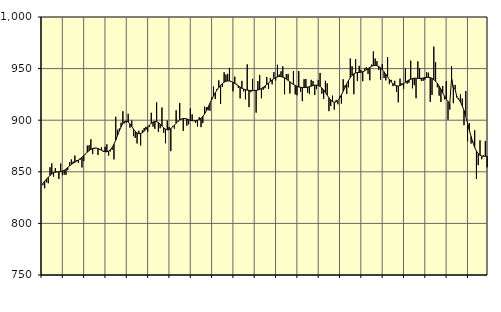
| Category | Piggar | Series 1 |
|---|---|---|
| nan | 837 | 838.9 |
| 1.0 | 834 | 840.96 |
| 1.0 | 839.9 | 842.87 |
| 1.0 | 838.9 | 844.65 |
| 1.0 | 854.4 | 846.36 |
| 1.0 | 858.2 | 847.87 |
| 1.0 | 845.3 | 848.96 |
| 1.0 | 853.5 | 849.65 |
| 1.0 | 850.2 | 849.94 |
| 1.0 | 843.1 | 850.06 |
| 1.0 | 858 | 850.23 |
| 1.0 | 846.8 | 850.65 |
| nan | 847.2 | 851.45 |
| 2.0 | 847.1 | 852.67 |
| 2.0 | 851.6 | 854.14 |
| 2.0 | 859.2 | 855.68 |
| 2.0 | 862 | 857.07 |
| 2.0 | 859.9 | 858.26 |
| 2.0 | 865.7 | 859.32 |
| 2.0 | 861.2 | 860.35 |
| 2.0 | 858.5 | 861.45 |
| 2.0 | 861.7 | 862.71 |
| 2.0 | 854.2 | 864.14 |
| 2.0 | 860.4 | 865.7 |
| nan | 866.9 | 867.37 |
| 3.0 | 875.4 | 869.02 |
| 3.0 | 875.8 | 870.52 |
| 3.0 | 881.5 | 871.74 |
| 3.0 | 867.1 | 872.55 |
| 3.0 | 872.2 | 872.94 |
| 3.0 | 873.2 | 872.95 |
| 3.0 | 866.4 | 872.54 |
| 3.0 | 871.2 | 871.82 |
| 3.0 | 873.6 | 870.94 |
| 3.0 | 869.3 | 870.08 |
| 3.0 | 874.2 | 869.51 |
| nan | 876.6 | 869.43 |
| 4.0 | 865.7 | 869.99 |
| 4.0 | 869.8 | 871.36 |
| 4.0 | 871.4 | 873.59 |
| 4.0 | 862 | 876.74 |
| 4.0 | 903.3 | 880.7 |
| 4.0 | 890.7 | 885.12 |
| 4.0 | 892 | 889.56 |
| 4.0 | 897.5 | 893.59 |
| 4.0 | 908.7 | 896.74 |
| 4.0 | 897 | 898.63 |
| 4.0 | 897.9 | 899.1 |
| nan | 906.2 | 898.25 |
| 5.0 | 892.8 | 896.38 |
| 5.0 | 899.6 | 893.91 |
| 5.0 | 884.5 | 891.32 |
| 5.0 | 882.8 | 889.13 |
| 5.0 | 877.5 | 887.59 |
| 5.0 | 889.8 | 886.86 |
| 5.0 | 875.5 | 887.01 |
| 5.0 | 890.4 | 887.88 |
| 5.0 | 892.5 | 889.34 |
| 5.0 | 893.6 | 891.27 |
| 5.0 | 888.7 | 893.39 |
| nan | 893.5 | 895.38 |
| 6.0 | 907.2 | 897.06 |
| 6.0 | 893.7 | 898.25 |
| 6.0 | 891.6 | 898.79 |
| 6.0 | 917.3 | 898.6 |
| 6.0 | 888.7 | 897.68 |
| 6.0 | 892.2 | 896.13 |
| 6.0 | 912.3 | 894.28 |
| 6.0 | 887.7 | 892.57 |
| 6.0 | 877.7 | 891.29 |
| 6.0 | 899.7 | 890.71 |
| 6.0 | 893.5 | 890.95 |
| nan | 870 | 891.92 |
| 7.0 | 894.2 | 893.39 |
| 7.0 | 891.8 | 895.15 |
| 7.0 | 909.6 | 897.02 |
| 7.0 | 899.4 | 898.79 |
| 7.0 | 916.7 | 900.19 |
| 7.0 | 900.9 | 901.18 |
| 7.0 | 889.7 | 901.67 |
| 7.0 | 901.7 | 901.61 |
| 7.0 | 894.6 | 901.2 |
| 7.0 | 896 | 900.57 |
| 7.0 | 911.4 | 899.92 |
| nan | 905.6 | 899.49 |
| 8.0 | 899.3 | 899.35 |
| 8.0 | 897.4 | 899.5 |
| 8.0 | 893.9 | 899.96 |
| 8.0 | 902.9 | 900.75 |
| 8.0 | 893.3 | 901.95 |
| 8.0 | 897.1 | 903.68 |
| 8.0 | 913.1 | 906.1 |
| 8.0 | 912.5 | 909.22 |
| 8.0 | 909.6 | 912.77 |
| 8.0 | 909.2 | 916.48 |
| 8.0 | 921.9 | 920.09 |
| nan | 932.6 | 923.45 |
| 9.0 | 920.5 | 926.51 |
| 9.0 | 930.3 | 929.25 |
| 9.0 | 938.6 | 931.67 |
| 9.0 | 915.9 | 933.79 |
| 9.0 | 932.1 | 935.52 |
| 9.0 | 946.4 | 936.84 |
| 9.0 | 944.2 | 937.75 |
| 9.0 | 944.9 | 938.07 |
| 9.0 | 950.7 | 937.96 |
| 9.0 | 937.7 | 937.51 |
| 9.0 | 928 | 936.72 |
| nan | 942.2 | 935.61 |
| 10.0 | 935.2 | 934.42 |
| 10.0 | 931.2 | 933.25 |
| 10.0 | 921.1 | 932.05 |
| 10.0 | 938.1 | 930.94 |
| 10.0 | 927.9 | 930.08 |
| 10.0 | 920.2 | 929.51 |
| 10.0 | 954.1 | 929.16 |
| 10.0 | 912.7 | 928.96 |
| 10.0 | 927.1 | 928.79 |
| 10.0 | 940.1 | 928.68 |
| 10.0 | 929.4 | 928.7 |
| nan | 907.3 | 928.87 |
| 11.0 | 937.9 | 929.24 |
| 11.0 | 943.9 | 929.88 |
| 11.0 | 921.3 | 930.77 |
| 11.0 | 929.5 | 931.85 |
| 11.0 | 931 | 933.13 |
| 11.0 | 941.8 | 934.58 |
| 11.0 | 930.3 | 936.07 |
| 11.0 | 940.9 | 937.55 |
| 11.0 | 934.7 | 939.04 |
| 11.0 | 946.6 | 940.29 |
| 11.0 | 938.5 | 941.26 |
| nan | 953.7 | 942.01 |
| 12.0 | 944.3 | 942.38 |
| 12.0 | 947.4 | 942.25 |
| 12.0 | 952.2 | 941.75 |
| 12.0 | 925.1 | 940.98 |
| 12.0 | 944.7 | 939.89 |
| 12.0 | 944.8 | 938.59 |
| 12.0 | 925.9 | 937.22 |
| 12.0 | 936.1 | 935.88 |
| 12.0 | 947.7 | 934.63 |
| 12.0 | 925 | 933.58 |
| 12.0 | 924.2 | 932.79 |
| nan | 947.6 | 932.26 |
| 13.0 | 927.5 | 931.88 |
| 13.0 | 918.5 | 931.63 |
| 13.0 | 939.7 | 931.59 |
| 13.0 | 939.9 | 931.74 |
| 13.0 | 926.7 | 932.05 |
| 13.0 | 925.3 | 932.47 |
| 13.0 | 939.1 | 933.01 |
| 13.0 | 938 | 933.56 |
| 13.0 | 924.5 | 933.94 |
| 13.0 | 930.1 | 933.98 |
| 13.0 | 938.9 | 933.64 |
| nan | 945.8 | 932.75 |
| 14.0 | 925.7 | 931.29 |
| 14.0 | 920.6 | 929.31 |
| 14.0 | 938.2 | 926.89 |
| 14.0 | 935.7 | 924.25 |
| 14.0 | 908.8 | 921.75 |
| 14.0 | 913.8 | 919.62 |
| 14.0 | 923.8 | 918.06 |
| 14.0 | 910.3 | 917.37 |
| 14.0 | 919.4 | 917.7 |
| 14.0 | 915.4 | 919.13 |
| 14.0 | 922.9 | 921.47 |
| nan | 916.1 | 924.48 |
| 15.0 | 939.7 | 927.96 |
| 15.0 | 933.6 | 931.69 |
| 15.0 | 925.4 | 935.28 |
| 15.0 | 931.9 | 938.46 |
| 15.0 | 959.8 | 941.18 |
| 15.0 | 952.3 | 943.4 |
| 15.0 | 925.2 | 944.94 |
| 15.0 | 959.2 | 945.79 |
| 15.0 | 937.9 | 946.15 |
| 15.0 | 952.7 | 946.28 |
| 15.0 | 948.5 | 946.49 |
| nan | 937.8 | 946.93 |
| 16.0 | 950.1 | 947.71 |
| 16.0 | 951.3 | 948.78 |
| 16.0 | 944.8 | 950.02 |
| 16.0 | 938.7 | 951.26 |
| 16.0 | 953.9 | 952.28 |
| 16.0 | 966.7 | 952.89 |
| 16.0 | 959.7 | 953.07 |
| 16.0 | 957.2 | 952.81 |
| 16.0 | 948.8 | 952.05 |
| 16.0 | 939.3 | 950.8 |
| 16.0 | 954.3 | 949.02 |
| nan | 940.9 | 946.88 |
| 17.0 | 938.6 | 944.44 |
| 17.0 | 961.1 | 941.86 |
| 17.0 | 934.9 | 939.4 |
| 17.0 | 939.1 | 937.18 |
| 17.0 | 933 | 935.35 |
| 17.0 | 938.2 | 934 |
| 17.0 | 927.4 | 933.27 |
| 17.0 | 917.3 | 933.15 |
| 17.0 | 940.3 | 933.53 |
| 17.0 | 935.8 | 934.36 |
| 17.0 | 930.3 | 935.5 |
| nan | 950.1 | 936.77 |
| 18.0 | 935.3 | 937.99 |
| 18.0 | 936.2 | 938.96 |
| 18.0 | 957.7 | 939.69 |
| 18.0 | 930.9 | 940.34 |
| 18.0 | 933.9 | 940.7 |
| 18.0 | 921.3 | 940.71 |
| 18.0 | 957 | 940.54 |
| 18.0 | 950.6 | 940.45 |
| 18.0 | 938.1 | 940.6 |
| 18.0 | 938.1 | 940.89 |
| 18.0 | 939.4 | 941.26 |
| nan | 946.4 | 941.49 |
| 19.0 | 946 | 941.49 |
| 19.0 | 917.8 | 941.24 |
| 19.0 | 924.4 | 940.54 |
| 19.0 | 971.3 | 939.38 |
| 19.0 | 956.1 | 937.8 |
| 19.0 | 931.9 | 935.73 |
| 19.0 | 923.8 | 933.13 |
| 19.0 | 917.6 | 929.99 |
| 19.0 | 933.2 | 926.59 |
| 19.0 | 920.2 | 923.35 |
| 19.0 | 937.8 | 920.41 |
| nan | 900.5 | 918.05 |
| 20.0 | 910.3 | 916.36 |
| 20.0 | 952.1 | 940.49 |
| 20.0 | 916.5 | 930.86 |
| 20.0 | 934.2 | 930.09 |
| 20.0 | 923.2 | 922.12 |
| 20.0 | 921.6 | 920.27 |
| 20.0 | 925.1 | 917.64 |
| 20.0 | 921 | 914.03 |
| 20.0 | 895.2 | 909.34 |
| 20.0 | 928.2 | 903.59 |
| 20.0 | 879.7 | 897.15 |
| nan | 897.2 | 890.51 |
| 21.0 | 877.4 | 884.18 |
| 21.0 | 879.3 | 878.48 |
| 21.0 | 890.2 | 873.72 |
| 21.0 | 843.1 | 870.11 |
| 21.0 | 856.5 | 867.58 |
| 21.0 | 880.5 | 866.04 |
| 21.0 | 862.2 | 865.29 |
| 21.0 | 866 | 865.05 |
| 21.0 | 879.9 | 865.06 |
| 21.0 | 854.3 | 865.07 |